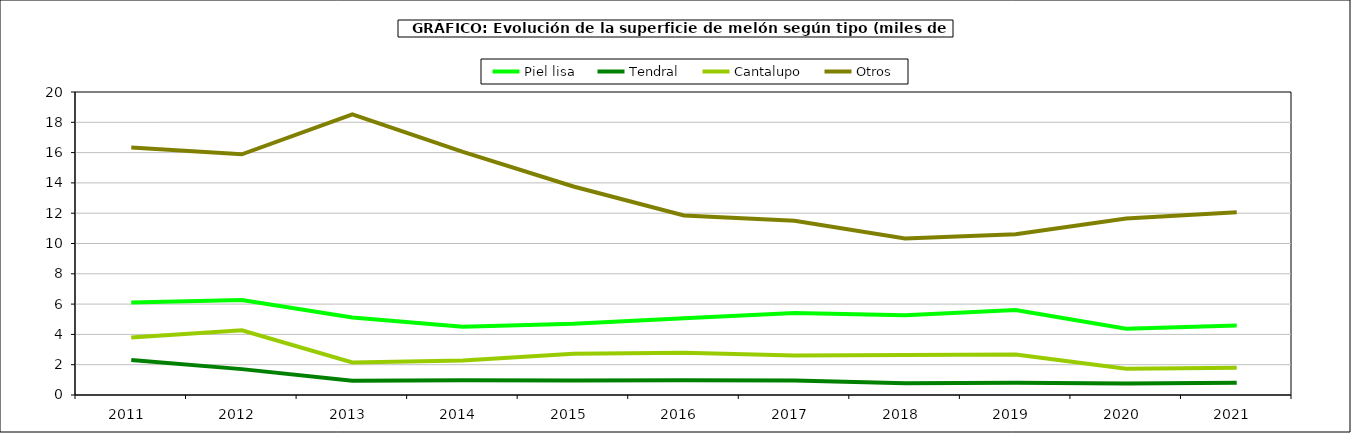
| Category | Piel lisa | Tendral | Cantalupo | Otros |
|---|---|---|---|---|
| 2011.0 | 6.109 | 2.318 | 3.791 | 16.343 |
| 2012.0 | 6.265 | 1.708 | 4.27 | 15.887 |
| 2013.0 | 5.109 | 0.939 | 2.152 | 18.523 |
| 2014.0 | 4.503 | 0.973 | 2.277 | 16.047 |
| 2015.0 | 4.698 | 0.96 | 2.723 | 13.763 |
| 2016.0 | 5.074 | 0.966 | 2.793 | 11.853 |
| 2017.0 | 5.417 | 0.953 | 2.608 | 11.495 |
| 2018.0 | 5.27 | 0.78 | 2.648 | 10.327 |
| 2019.0 | 5.608 | 0.803 | 2.669 | 10.611 |
| 2020.0 | 4.38 | 0.765 | 1.727 | 11.645 |
| 2021.0 | 4.593 | 0.805 | 1.805 | 12.057 |